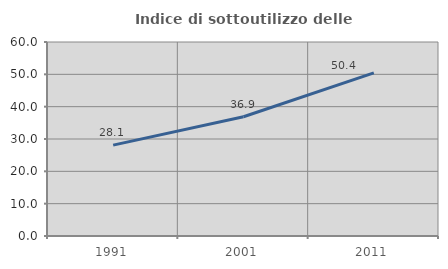
| Category | Indice di sottoutilizzo delle abitazioni  |
|---|---|
| 1991.0 | 28.097 |
| 2001.0 | 36.876 |
| 2011.0 | 50.442 |